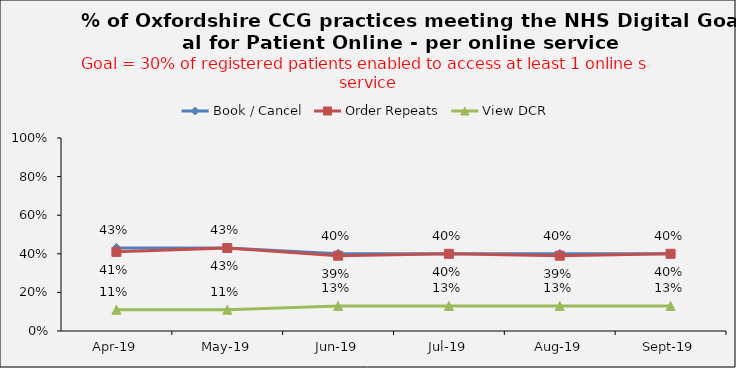
| Category | Book / Cancel | Order Repeats | View DCR |
|---|---|---|---|
| 2019-04-01 | 0.43 | 0.41 | 0.11 |
| 2019-05-01 | 0.43 | 0.43 | 0.11 |
| 2019-06-01 | 0.4 | 0.39 | 0.13 |
| 2019-07-01 | 0.4 | 0.4 | 0.13 |
| 2019-08-01 | 0.4 | 0.39 | 0.13 |
| 2019-09-01 | 0.4 | 0.4 | 0.13 |